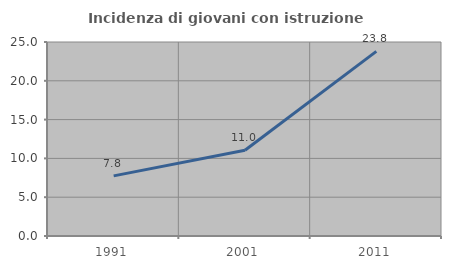
| Category | Incidenza di giovani con istruzione universitaria |
|---|---|
| 1991.0 | 7.751 |
| 2001.0 | 11.046 |
| 2011.0 | 23.797 |